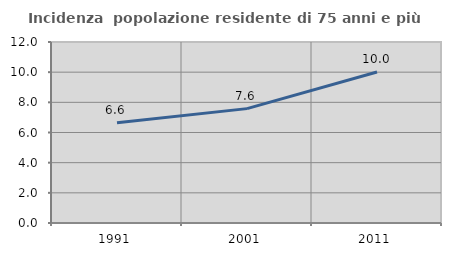
| Category | Incidenza  popolazione residente di 75 anni e più |
|---|---|
| 1991.0 | 6.641 |
| 2001.0 | 7.583 |
| 2011.0 | 10.008 |